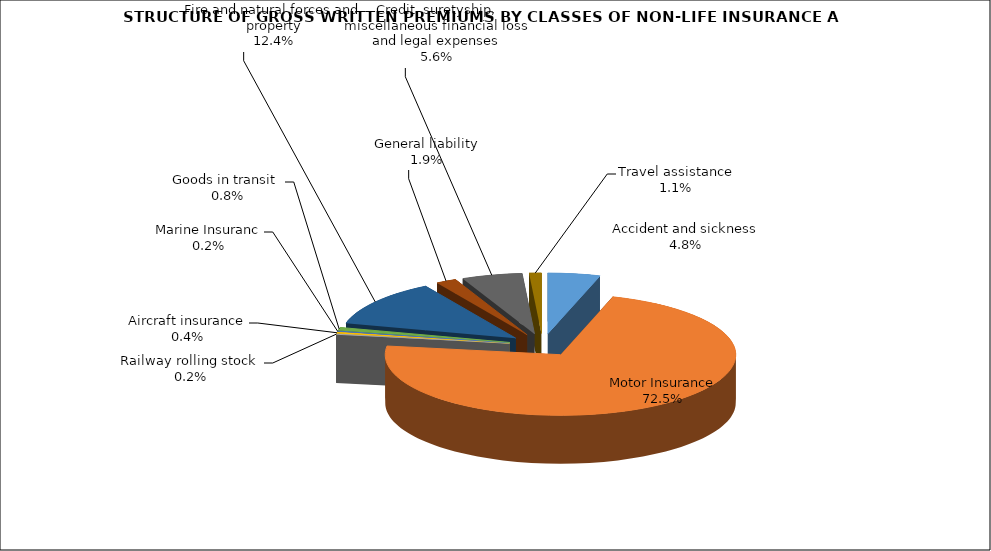
| Category | Accident and sickness |
|---|---|
| Accident and sickness | 0.048 |
| Motor Insurance | 0.725 |
| Railway rolling stock  | 0.002 |
| Aircraft insurance | 0.004 |
| Marine Insuranc | 0.002 |
| Goods in transit  | 0.008 |
| Fire and natural forces and property | 0.124 |
| General liability | 0.019 |
| Credit, suretyship, miscellaneous financial loss and legal expenses | 0.056 |
| Travel assistance | 0.011 |